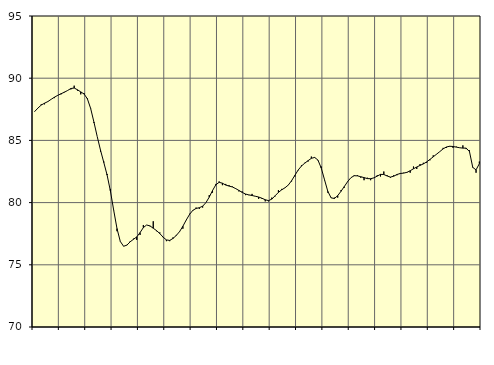
| Category | Piggar | Series 1 |
|---|---|---|
| nan | 87.3 | 87.32 |
| 87.0 | 87.6 | 87.6 |
| 87.0 | 87.9 | 87.84 |
| 87.0 | 87.9 | 87.99 |
| nan | 88.1 | 88.12 |
| 88.0 | 88.3 | 88.3 |
| 88.0 | 88.4 | 88.47 |
| 88.0 | 88.6 | 88.62 |
| nan | 88.7 | 88.75 |
| 89.0 | 88.9 | 88.87 |
| 89.0 | 89 | 89.01 |
| 89.0 | 89.1 | 89.17 |
| nan | 89.4 | 89.21 |
| 90.0 | 89 | 89.07 |
| 90.0 | 88.7 | 88.9 |
| 90.0 | 88.8 | 88.73 |
| nan | 88.4 | 88.35 |
| 91.0 | 87.6 | 87.57 |
| 91.0 | 86.4 | 86.47 |
| 91.0 | 85.3 | 85.3 |
| nan | 84.1 | 84.21 |
| 92.0 | 83.3 | 83.22 |
| 92.0 | 82.3 | 82.21 |
| 92.0 | 81.1 | 80.93 |
| nan | 79.4 | 79.38 |
| 93.0 | 77.7 | 77.91 |
| 93.0 | 76.9 | 76.88 |
| 93.0 | 76.5 | 76.49 |
| nan | 76.6 | 76.58 |
| 94.0 | 76.9 | 76.85 |
| 94.0 | 77.1 | 77.05 |
| 94.0 | 77 | 77.24 |
| nan | 77.4 | 77.59 |
| 95.0 | 78.2 | 77.99 |
| 95.0 | 78.2 | 78.2 |
| 95.0 | 78.1 | 78.13 |
| nan | 78.5 | 77.94 |
| 96.0 | 77.7 | 77.75 |
| 96.0 | 77.6 | 77.51 |
| 96.0 | 77.2 | 77.22 |
| nan | 76.9 | 77 |
| 97.0 | 76.9 | 76.96 |
| 97.0 | 77.2 | 77.12 |
| 97.0 | 77.4 | 77.36 |
| nan | 77.7 | 77.67 |
| 98.0 | 77.9 | 78.1 |
| 98.0 | 78.6 | 78.59 |
| 98.0 | 79.1 | 79.04 |
| nan | 79.4 | 79.37 |
| 99.0 | 79.6 | 79.53 |
| 99.0 | 79.5 | 79.59 |
| 99.0 | 79.6 | 79.71 |
| nan | 80 | 80 |
| 0.0 | 80.6 | 80.44 |
| 0.0 | 80.8 | 80.97 |
| 0.0 | 81.5 | 81.43 |
| nan | 81.7 | 81.63 |
| 1.0 | 81.4 | 81.56 |
| 1.0 | 81.5 | 81.41 |
| 1.0 | 81.4 | 81.33 |
| nan | 81.3 | 81.26 |
| 2.0 | 81.1 | 81.13 |
| 2.0 | 80.9 | 80.98 |
| 2.0 | 80.9 | 80.82 |
| nan | 80.6 | 80.69 |
| 3.0 | 80.6 | 80.62 |
| 3.0 | 80.7 | 80.57 |
| 3.0 | 80.5 | 80.51 |
| nan | 80.3 | 80.45 |
| 4.0 | 80.3 | 80.35 |
| 4.0 | 80.1 | 80.23 |
| 4.0 | 80.1 | 80.16 |
| nan | 80.4 | 80.28 |
| 5.0 | 80.5 | 80.55 |
| 5.0 | 81 | 80.82 |
| 5.0 | 81.1 | 81.03 |
| nan | 81.2 | 81.19 |
| 6.0 | 81.4 | 81.41 |
| 6.0 | 81.7 | 81.76 |
| 6.0 | 82.1 | 82.19 |
| nan | 82.6 | 82.62 |
| 7.0 | 83 | 82.94 |
| 7.0 | 83.2 | 83.17 |
| 7.0 | 83.3 | 83.37 |
| nan | 83.7 | 83.56 |
| 8.0 | 83.6 | 83.63 |
| 8.0 | 83.4 | 83.42 |
| 8.0 | 82.9 | 82.78 |
| nan | 81.8 | 81.84 |
| 9.0 | 80.8 | 80.9 |
| 9.0 | 80.4 | 80.38 |
| 9.0 | 80.4 | 80.33 |
| nan | 80.4 | 80.56 |
| 10.0 | 81 | 80.91 |
| 10.0 | 81.2 | 81.29 |
| 10.0 | 81.7 | 81.68 |
| nan | 82 | 82 |
| 11.0 | 82.2 | 82.16 |
| 11.0 | 82.2 | 82.15 |
| 11.0 | 82 | 82.08 |
| nan | 81.8 | 82.01 |
| 12.0 | 82 | 81.93 |
| 12.0 | 81.8 | 81.92 |
| 12.0 | 82 | 81.99 |
| nan | 82.2 | 82.13 |
| 13.0 | 82.1 | 82.27 |
| 13.0 | 82.5 | 82.26 |
| 13.0 | 82.2 | 82.14 |
| nan | 82 | 82.05 |
| 14.0 | 82.2 | 82.12 |
| 14.0 | 82.2 | 82.26 |
| 14.0 | 82.3 | 82.34 |
| nan | 82.4 | 82.37 |
| 15.0 | 82.4 | 82.43 |
| 15.0 | 82.4 | 82.56 |
| 15.0 | 82.9 | 82.72 |
| nan | 82.7 | 82.86 |
| 16.0 | 83.1 | 82.99 |
| 16.0 | 83.2 | 83.11 |
| 16.0 | 83.2 | 83.27 |
| nan | 83.4 | 83.47 |
| 17.0 | 83.8 | 83.68 |
| 17.0 | 83.9 | 83.89 |
| 17.0 | 84.1 | 84.1 |
| nan | 84.4 | 84.32 |
| 18.0 | 84.4 | 84.47 |
| 18.0 | 84.5 | 84.53 |
| 18.0 | 84.4 | 84.51 |
| nan | 84.5 | 84.46 |
| 19.0 | 84.4 | 84.41 |
| 19.0 | 84.6 | 84.38 |
| 19.0 | 84.3 | 84.38 |
| nan | 84.2 | 84.1 |
| 20.0 | 82.8 | 82.83 |
| 20.0 | 82.4 | 82.63 |
| 20.0 | 83.3 | 83.13 |